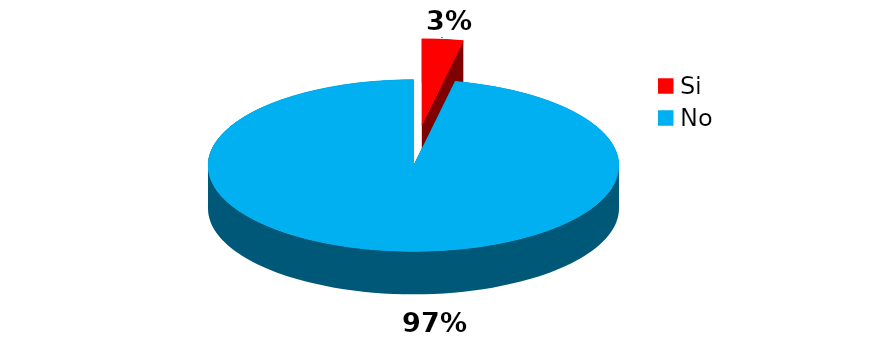
| Category | Series 0 |
|---|---|
| Si | 2 |
| No | 60 |